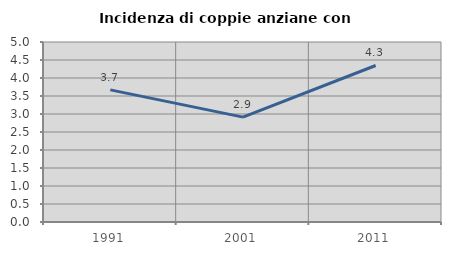
| Category | Incidenza di coppie anziane con figli |
|---|---|
| 1991.0 | 3.67 |
| 2001.0 | 2.913 |
| 2011.0 | 4.348 |